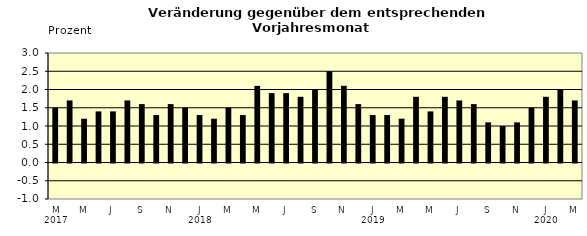
| Category | Series 0 |
|---|---|
| 0 | 1.5 |
| 1 | 1.7 |
| 2 | 1.2 |
| 3 | 1.4 |
| 4 | 1.4 |
| 5 | 1.7 |
| 6 | 1.6 |
| 7 | 1.3 |
| 8 | 1.6 |
| 9 | 1.5 |
| 10 | 1.3 |
| 11 | 1.2 |
| 12 | 1.5 |
| 13 | 1.3 |
| 14 | 2.1 |
| 15 | 1.9 |
| 16 | 1.9 |
| 17 | 1.8 |
| 18 | 2 |
| 19 | 2.5 |
| 20 | 2.1 |
| 21 | 1.6 |
| 22 | 1.3 |
| 23 | 1.3 |
| 24 | 1.2 |
| 25 | 1.8 |
| 26 | 1.4 |
| 27 | 1.8 |
| 28 | 1.7 |
| 29 | 1.6 |
| 30 | 1.1 |
| 31 | 1 |
| 32 | 1.1 |
| 33 | 1.5 |
| 34 | 1.8 |
| 35 | 2 |
| 36 | 1.7 |